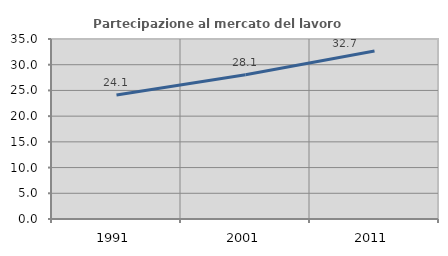
| Category | Partecipazione al mercato del lavoro  femminile |
|---|---|
| 1991.0 | 24.096 |
| 2001.0 | 28.06 |
| 2011.0 | 32.673 |